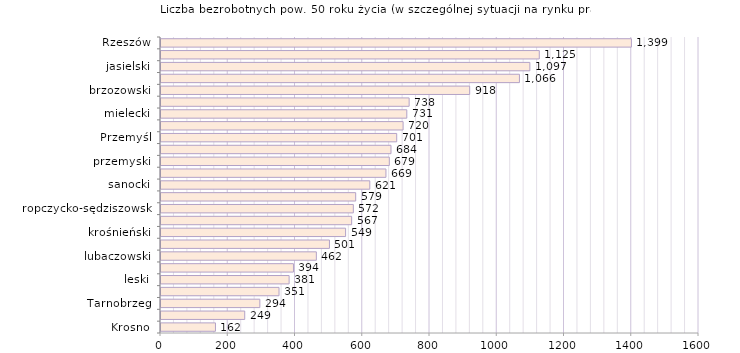
| Category | Liczba bezrobotnych powyżej 50 roku życia - w szczególnej sytuacji na rynku pracy |
|---|---|
| Krosno | 162 |
| bieszczadzki | 249 |
| Tarnobrzeg | 294 |
| tarnobrzeski  | 351 |
| leski | 381 |
| kolbuszowski | 394 |
| lubaczowski | 462 |
| stalowowolski | 501 |
| krośnieński | 549 |
| dębicki | 567 |
| ropczycko-sędziszowski | 572 |
| łańcucki | 579 |
| sanocki | 621 |
| przeworski | 669 |
| przemyski | 679 |
| leżajski | 684 |
| Przemyśl | 701 |
| strzyżowski | 720 |
| mielecki | 731 |
| niżański | 738 |
| brzozowski | 918 |
| jarosławski | 1066 |
| jasielski | 1097 |
| rzeszowski | 1125 |
| Rzeszów | 1399 |